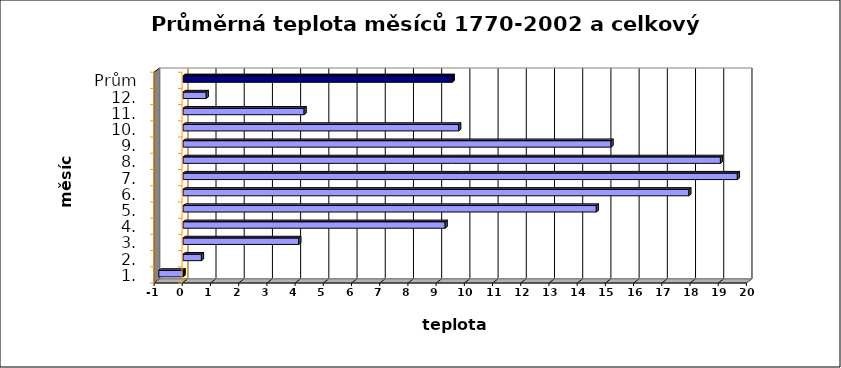
| Category | teplota |
|---|---|
| 1. | -0.86 |
| 2. | 0.65 |
| 3. | 4.1 |
| 4. | 9.29 |
| 5. | 14.65 |
| 6. | 17.93 |
| 7. | 19.65 |
| 8. | 19.05 |
| 9. | 15.17 |
| 10. | 9.77 |
| 11. | 4.29 |
| 12. | 0.82 |
| Prům | 9.54 |